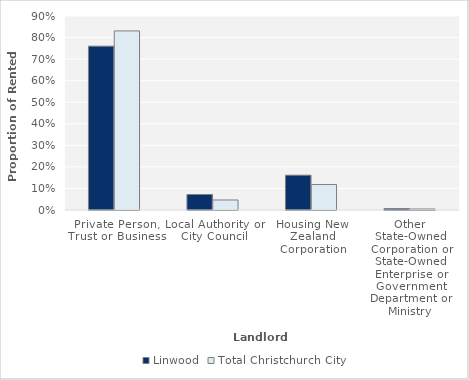
| Category | Linwood | Total Christchurch City |
|---|---|---|
| Private Person, Trust or Business | 0.76 | 0.831 |
| Local Authority or City Council | 0.072 | 0.046 |
| Housing New Zealand Corporation | 0.161 | 0.118 |
| Other State-Owned Corporation or State-Owned Enterprise or Government Department or Ministry | 0.006 | 0.005 |